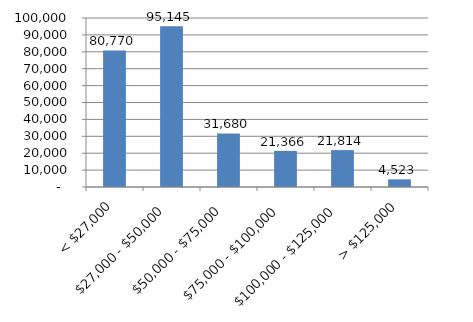
| Category | Series 0 |
|---|---|
| < $27,000 | 80769.905 |
| $27,000 - $50,000 | 95144.759 |
| $50,000 - $75,000 | 31680.091 |
| $75,000 - $100,000 | 21365.971 |
| $100,000 - $125,000 | 21814.034 |
| > $125,000 | 4523.145 |